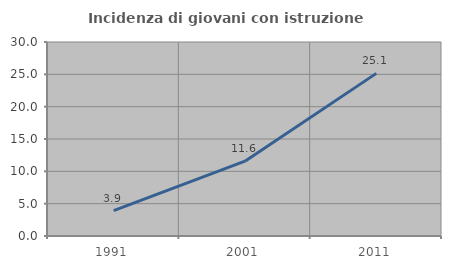
| Category | Incidenza di giovani con istruzione universitaria |
|---|---|
| 1991.0 | 3.916 |
| 2001.0 | 11.57 |
| 2011.0 | 25.148 |